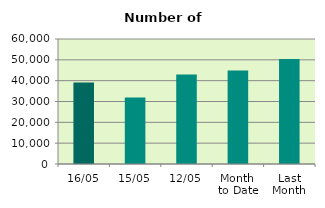
| Category | Series 0 |
|---|---|
| 16/05 | 39174 |
| 15/05 | 31862 |
| 12/05 | 42940 |
| Month 
to Date | 44885.455 |
| Last
Month | 50445.556 |